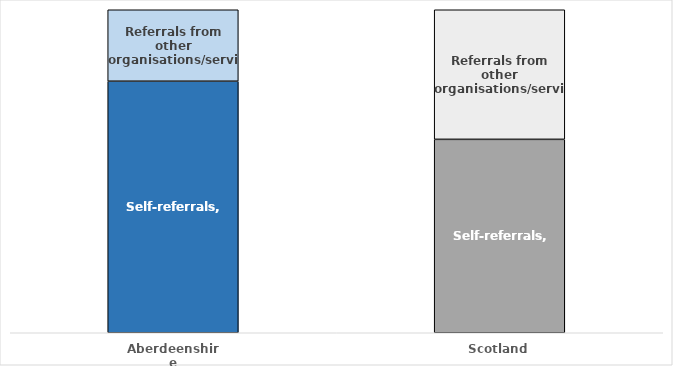
| Category | Self-referrals | Referrals from other organisations/services |
|---|---|---|
| Aberdeenshire | 0.779 | 0.221 |
| Scotland | 0.599 | 0.401 |